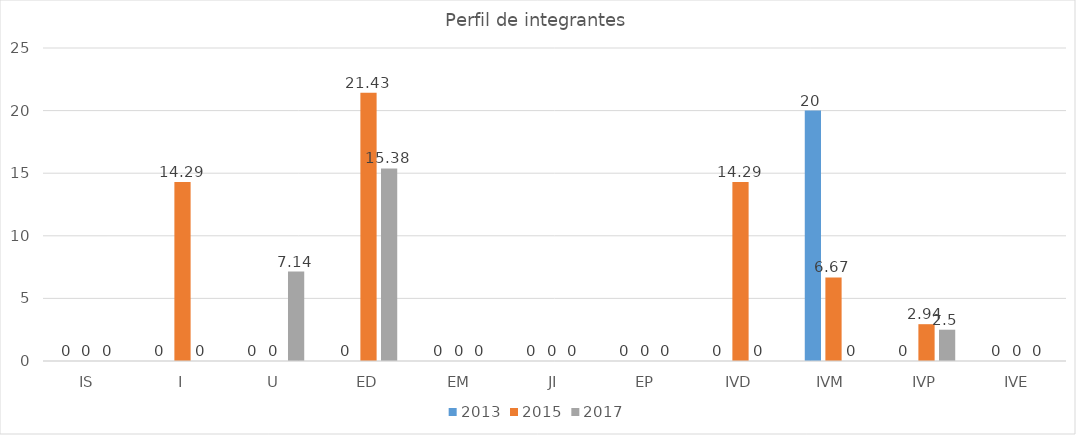
| Category | 2013 | 2015 | 2017 |
|---|---|---|---|
| IS | 0 | 0 | 0 |
| I | 0 | 14.29 | 0 |
| U | 0 | 0 | 7.14 |
| ED | 0 | 21.43 | 15.38 |
| EM | 0 | 0 | 0 |
| JI | 0 | 0 | 0 |
| EP | 0 | 0 | 0 |
| IVD | 0 | 14.29 | 0 |
| IVM | 20 | 6.67 | 0 |
| IVP | 0 | 2.94 | 2.5 |
| IVE | 0 | 0 | 0 |